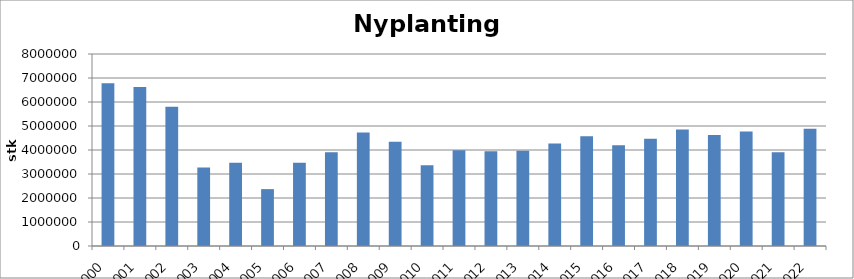
| Category | Totalt |
|---|---|
| 2000 | 6776969 |
| 2001 | 6622134 |
| 2002 | 5801712 |
| 2003 | 3271556 |
| 2004 | 3469386 |
| 2005 | 2370166 |
| 2006 | 3473699 |
| 2007 | 3902957 |
| 2008 | 4727511 |
| 2009 | 4345382 |
| 2010 | 3362757 |
| 2011 | 3984574 |
| 2012 | 3946714 |
| 2013 | 3968517 |
| 2014 | 4270889 |
| 2015 | 4574547 |
| 2016 | 4200212 |
| 2017 | 4468082 |
| 2018 | 4854955 |
| 2019 | 4623285 |
| 2020 | 4770709 |
| 2021 | 3901331 |
| 2022 | 4880230 |